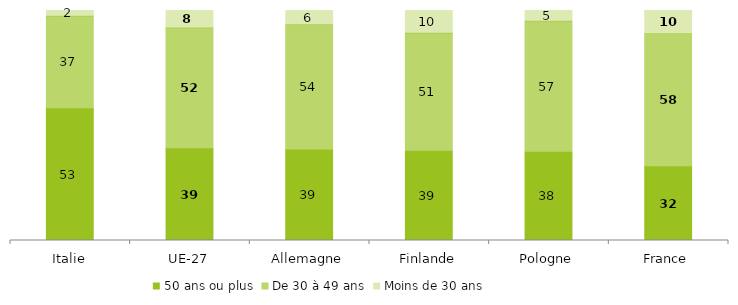
| Category | 50 ans ou plus | De 30 à 49 ans | Moins de 30 ans |
|---|---|---|---|
| Italie | 52.61 | 37.005 | 2.249 |
| UE-27 | 39.372 | 51.932 | 7.502 |
| Allemagne | 39.227 | 54.196 | 6.197 |
| Finlande | 38.851 | 51.209 | 9.94 |
| Pologne | 38.403 | 56.949 | 4.648 |
| France | 32.071 | 57.853 | 10.076 |